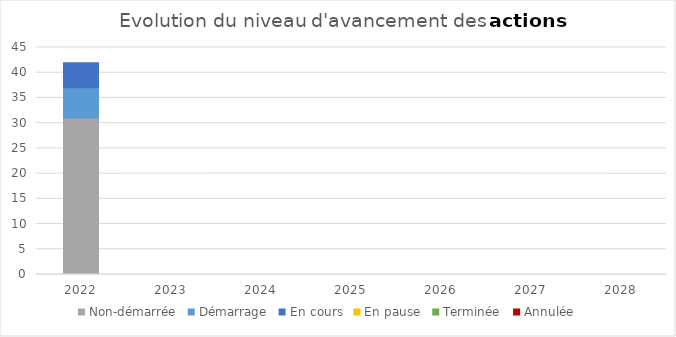
| Category | Non-démarrée | Démarrage | En cours | En pause | Terminée | Annulée |
|---|---|---|---|---|---|---|
| 2022.0 | 31 | 6 | 5 | 0 | 0 | 0 |
| 2023.0 | 0 | 0 | 0 | 0 | 0 | 0 |
| 2024.0 | 0 | 0 | 0 | 0 | 0 | 0 |
| 2025.0 | 0 | 0 | 0 | 0 | 0 | 0 |
| 2026.0 | 0 | 0 | 0 | 0 | 0 | 0 |
| 2027.0 | 0 | 0 | 0 | 0 | 0 | 0 |
| 2028.0 | 0 | 0 | 0 | 0 | 0 | 0 |